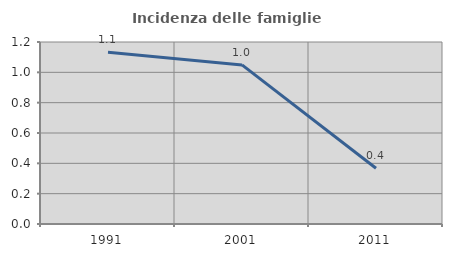
| Category | Incidenza delle famiglie numerose |
|---|---|
| 1991.0 | 1.132 |
| 2001.0 | 1.049 |
| 2011.0 | 0.368 |